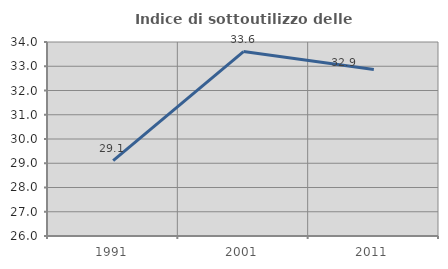
| Category | Indice di sottoutilizzo delle abitazioni  |
|---|---|
| 1991.0 | 29.104 |
| 2001.0 | 33.607 |
| 2011.0 | 32.867 |